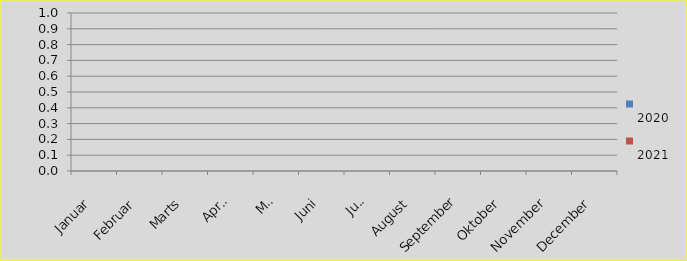
| Category | 
2020 | 
2021 |
|---|---|---|
| Januar |  | 0 |
| Februar |  | 0 |
| Marts |  | 0 |
| April |  | 0 |
| Maj |  | 0 |
| Juni |  | 0 |
| Juli |  | 0 |
| August |  | 0 |
| September |  | 0 |
| Oktober |  | 0 |
| November |  | 0 |
| December |  | 0 |